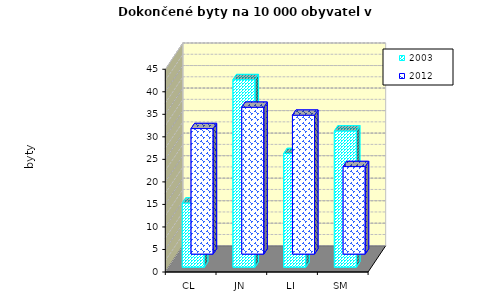
| Category | 2003 | 2012 |
|---|---|---|
| CL | 14.246 | 27.857 |
| JN | 41.632 | 32.584 |
| LI | 25.232 | 30.821 |
| SM | 30.245 | 19.422 |